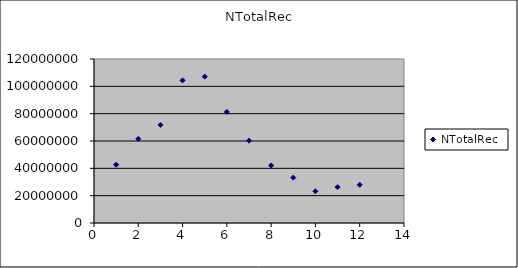
| Category | NTotalRec |
|---|---|
| 1.0 | 42631235.262 |
| 2.0 | 61583903.911 |
| 3.0 | 71757666.253 |
| 4.0 | 104320886.541 |
| 5.0 | 107097749.775 |
| 6.0 | 81261630.934 |
| 7.0 | 60226046.546 |
| 8.0 | 42104612.82 |
| 9.0 | 33177857.912 |
| 10.0 | 23204647.755 |
| 11.0 | 26226755.211 |
| 12.0 | 27968851.952 |